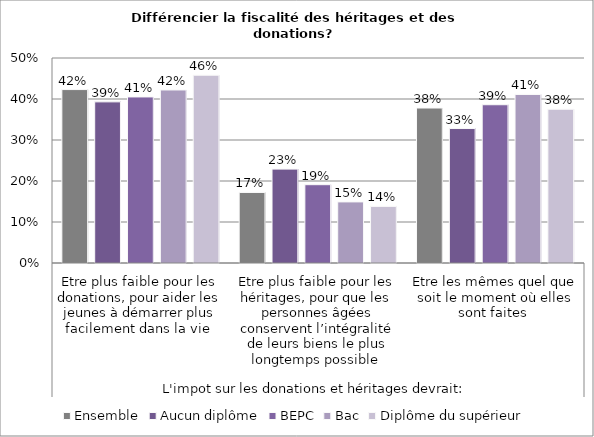
| Category | Ensemble | Aucun diplôme | BEPC | Bac | Diplôme du supérieur |
|---|---|---|---|---|---|
| 0 | 0.423 | 0.393 | 0.405 | 0.422 | 0.458 |
| 1 | 0.172 | 0.229 | 0.191 | 0.149 | 0.138 |
| 2 | 0.378 | 0.328 | 0.386 | 0.411 | 0.375 |